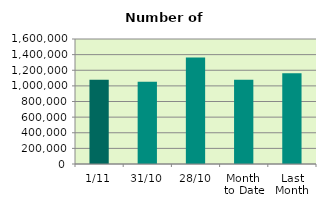
| Category | Series 0 |
|---|---|
| 1/11 | 1078380 |
| 31/10 | 1053594 |
| 28/10 | 1362104 |
| Month 
to Date | 1078380 |
| Last
Month | 1161301.714 |